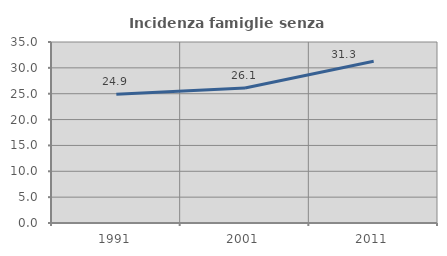
| Category | Incidenza famiglie senza nuclei |
|---|---|
| 1991.0 | 24.887 |
| 2001.0 | 26.105 |
| 2011.0 | 31.279 |